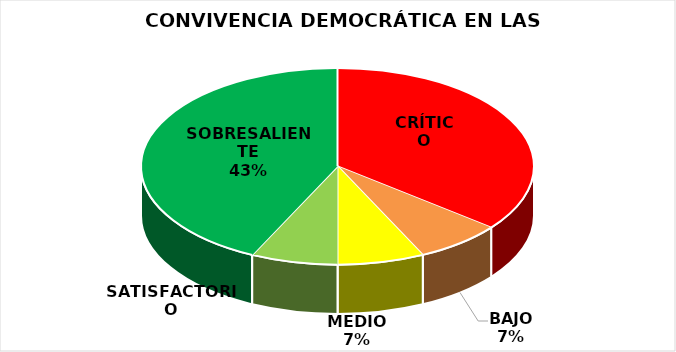
| Category | Series 0 |
|---|---|
| CRÍTICO | 5 |
| BAJO | 1 |
| MEDIO | 1 |
| SATISFACTORIO | 1 |
| SOBRESALIENTE | 6 |